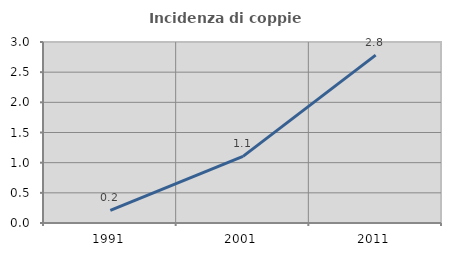
| Category | Incidenza di coppie miste |
|---|---|
| 1991.0 | 0.209 |
| 2001.0 | 1.105 |
| 2011.0 | 2.782 |